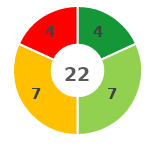
| Category | Series 0 |
|---|---|
| 0 | 4 |
| 1 | 7 |
| 2 | 7 |
| 3 | 4 |
| 4 | 0 |